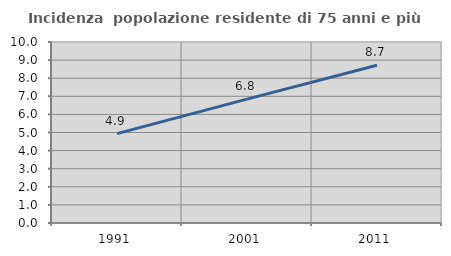
| Category | Incidenza  popolazione residente di 75 anni e più |
|---|---|
| 1991.0 | 4.939 |
| 2001.0 | 6.846 |
| 2011.0 | 8.72 |